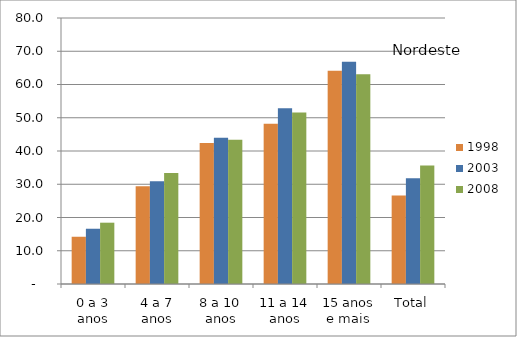
| Category | 1998 | 2003 | 2008 |
|---|---|---|---|
| 0 a 3 anos | 14.21 | 16.62 | 18.44 |
| 4 a 7 anos | 29.4 | 30.93 | 33.35 |
| 8 a 10 anos | 42.38 | 43.99 | 43.35 |
| 11 a 14 anos | 48.23 | 52.88 | 51.57 |
| 15 anos e mais | 64.13 | 66.86 | 63.08 |
| Total | 26.61 | 31.81 | 35.63 |